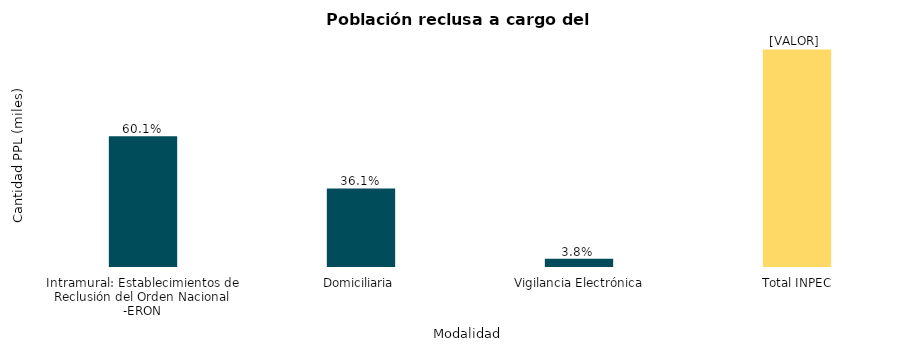
| Category | Total PPL |
|---|---|
| Intramural: Establecimientos de Reclusión del Orden Nacional -ERON | 102343 |
| Domiciliaria | 61491 |
|  Vigilancia Electrónica | 6401 |
|  Total INPEC | 170235 |